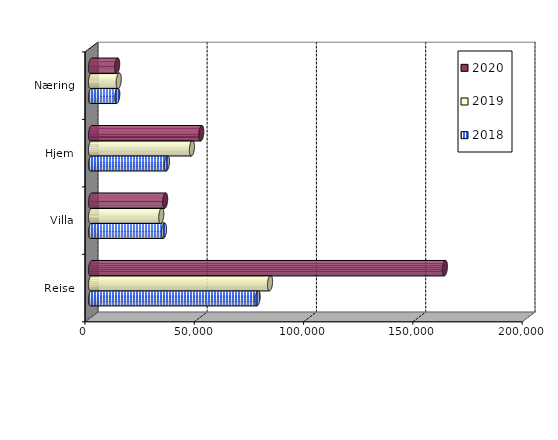
| Category | 2018 | 2019 | 2020 |
|---|---|---|---|
| Reise | 76206 | 81899 | 161886 |
| Villa | 33394.177 | 32150.91 | 33920.379 |
| Hjem | 34728.324 | 46176.704 | 50451.84 |
| Næring | 12011.183 | 12689.964 | 11962.421 |